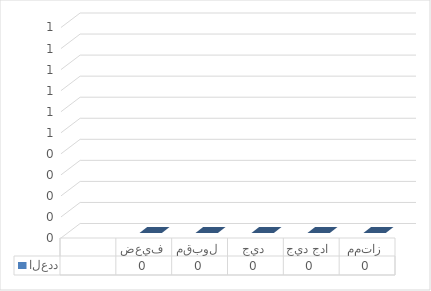
| Category | العدد |
|---|---|
| ممتاز | 0 |
| جيد جدا  | 0 |
| جيد | 0 |
| مقبول | 0 |
| ضعيف | 0 |